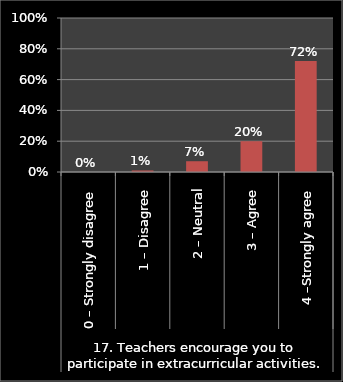
| Category | Series 0 |
|---|---|
| 0 | 0 |
| 1 | 0.01 |
| 2 | 0.07 |
| 3 | 0.2 |
| 4 | 0.72 |